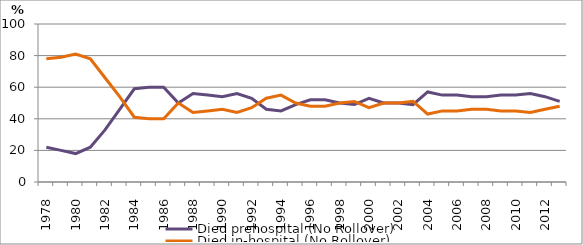
| Category | Died prehospital (No Rollover) | Died in-hospital (No Rollover) |
|---|---|---|
| 1978.0 | 22 | 78 |
| 1979.0 | 20 | 79 |
| 1980.0 | 18 | 81 |
| 1981.0 | 22 | 78 |
| 1982.0 | 33 | 66 |
| 1983.0 | 46 | 54 |
| 1984.0 | 59 | 41 |
| 1985.0 | 60 | 40 |
| 1986.0 | 60 | 40 |
| 1987.0 | 50 | 50 |
| 1988.0 | 56 | 44 |
| 1989.0 | 55 | 45 |
| 1990.0 | 54 | 46 |
| 1991.0 | 56 | 44 |
| 1992.0 | 53 | 47 |
| 1993.0 | 46 | 53 |
| 1994.0 | 45 | 55 |
| 1995.0 | 49 | 50 |
| 1996.0 | 52 | 48 |
| 1997.0 | 52 | 48 |
| 1998.0 | 50 | 50 |
| 1999.0 | 49 | 51 |
| 2000.0 | 53 | 47 |
| 2001.0 | 50 | 50 |
| 2002.0 | 50 | 50 |
| 2003.0 | 49 | 51 |
| 2004.0 | 57 | 43 |
| 2005.0 | 55 | 45 |
| 2006.0 | 55 | 45 |
| 2007.0 | 54 | 46 |
| 2008.0 | 54 | 46 |
| 2009.0 | 55 | 45 |
| 2010.0 | 55 | 45 |
| 2011.0 | 56 | 44 |
| 2012.0 | 54 | 46 |
| 2013.0 | 51 | 48 |